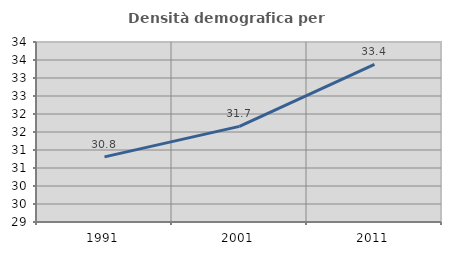
| Category | Densità demografica |
|---|---|
| 1991.0 | 30.808 |
| 2001.0 | 31.656 |
| 2011.0 | 33.378 |